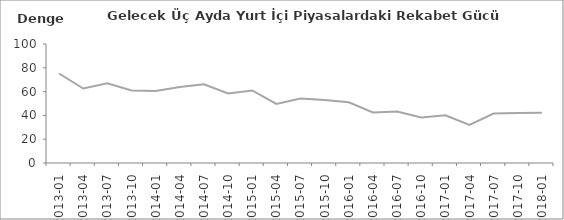
| Category | Series 2 |
|---|---|
| 2013-01 | 75.2 |
| 2013-04 | 62.6 |
| 2013-07 | 66.9 |
| 2013-10 | 61 |
| 2014-01 | 60.5 |
| 2014-04 | 63.8 |
| 2014-07 | 66.1 |
| 2014-10 | 58.4 |
| 2015-01 | 61 |
| 2015-04 | 49.7 |
| 2015-07 | 54.1 |
| 2015-10 | 52.9 |
| 2016-01 | 51 |
| 2016-04 | 42.5 |
| 2016-07 | 43.3 |
| 2016-10 | 38.2 |
| 2017-01 | 40.1 |
| 2017-04 | 32 |
| 2017-07 | 41.5 |
| 2017-10 | 42 |
| 2018-01 | 42.2 |